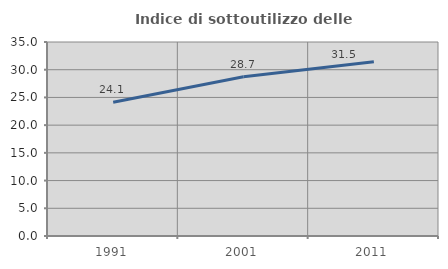
| Category | Indice di sottoutilizzo delle abitazioni  |
|---|---|
| 1991.0 | 24.124 |
| 2001.0 | 28.726 |
| 2011.0 | 31.457 |